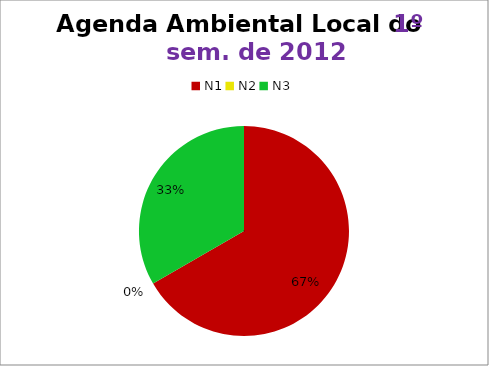
| Category | 1º/12 |
|---|---|
| N1 | 20 |
| N2 | 0 |
| N3 | 10 |